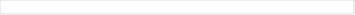
| Category | Korporasi Ritel Mikro KPR Non
KPR |
|---|---|
| 0 | 8.421 |
| 1 | 9.406 |
| 2 | 11.369 |
| 3 | 9.104 |
| 4 | 9.99 |